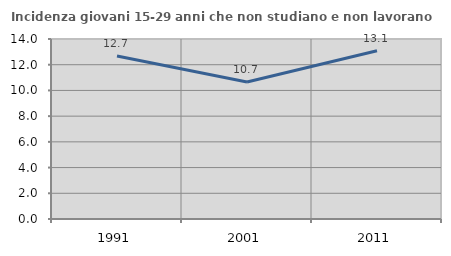
| Category | Incidenza giovani 15-29 anni che non studiano e non lavorano  |
|---|---|
| 1991.0 | 12.671 |
| 2001.0 | 10.658 |
| 2011.0 | 13.087 |